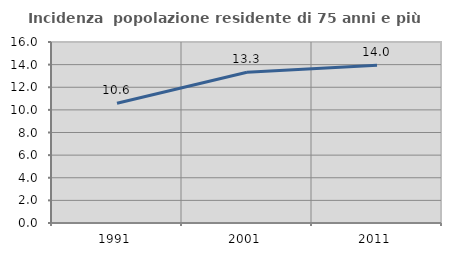
| Category | Incidenza  popolazione residente di 75 anni e più |
|---|---|
| 1991.0 | 10.58 |
| 2001.0 | 13.329 |
| 2011.0 | 13.953 |